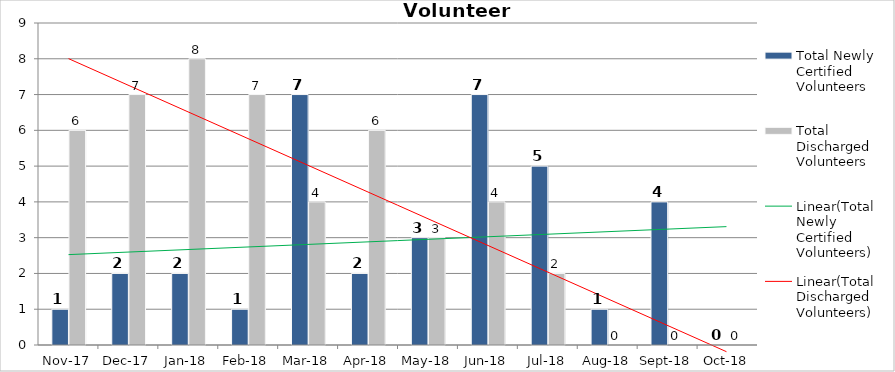
| Category | Total Newly Certified Volunteers | Total Discharged Volunteers |
|---|---|---|
| 2017-11-01 | 1 | 6 |
| 2017-12-01 | 2 | 7 |
| 2018-01-01 | 2 | 8 |
| 2018-02-01 | 1 | 7 |
| 2018-03-01 | 7 | 4 |
| 2018-04-01 | 2 | 6 |
| 2018-05-01 | 3 | 3 |
| 2018-06-01 | 7 | 4 |
| 2018-07-01 | 5 | 2 |
| 2018-08-01 | 1 | 0 |
| 2018-09-01 | 4 | 0 |
| 2018-10-01 | 0 | 0 |